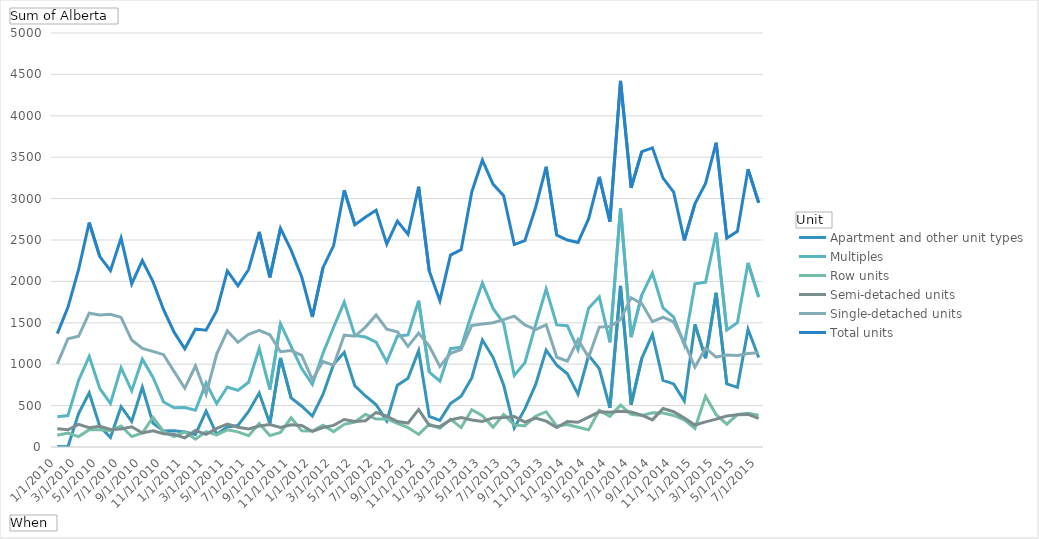
| Category | Apartment and other unit types | Multiples | Row units | Semi-detached units | Single-detached units | Total units |
|---|---|---|---|---|---|---|
| 1/1/2010 | 5 | 366 | 141 | 220 | 1003 | 1369 |
| 2/1/2010 | 3 | 380 | 169 | 208 | 1307 | 1687 |
| 3/1/2010 | 404 | 804 | 126 | 274 | 1337 | 2141 |
| 4/1/2010 | 654 | 1095 | 209 | 232 | 1616 | 2711 |
| 5/1/2010 | 247 | 706 | 209 | 250 | 1593 | 2299 |
| 6/1/2010 | 115 | 527 | 200 | 212 | 1603 | 2130 |
| 7/1/2010 | 487 | 958 | 253 | 218 | 1565 | 2523 |
| 8/1/2010 | 309 | 679 | 125 | 245 | 1292 | 1971 |
| 9/1/2010 | 722 | 1061 | 169 | 170 | 1191 | 2252 |
| 10/1/2010 | 288 | 842 | 358 | 196 | 1155 | 1997 |
| 11/1/2010 | 194 | 543 | 188 | 161 | 1115 | 1658 |
| 12/1/2010 | 196 | 474 | 127 | 151 | 910 | 1384 |
| 1/1/2011 | 181 | 476 | 184 | 111 | 710 | 1186 |
| 2/1/2011 | 151 | 444 | 94 | 199 | 981 | 1425 |
| 3/1/2011 | 434 | 773 | 186 | 153 | 638 | 1411 |
| 4/1/2011 | 153 | 524 | 146 | 225 | 1122 | 1646 |
| 5/1/2011 | 241 | 725 | 208 | 276 | 1402 | 2127 |
| 6/1/2011 | 261 | 683 | 183 | 239 | 1264 | 1947 |
| 7/1/2011 | 429 | 782 | 136 | 217 | 1362 | 2144 |
| 8/1/2011 | 652 | 1189 | 284 | 253 | 1410 | 2599 |
| 9/1/2011 | 284 | 694 | 138 | 272 | 1355 | 2049 |
| 10/1/2011 | 1076 | 1489 | 176 | 237 | 1151 | 2640 |
| 11/1/2011 | 593 | 1214 | 353 | 268 | 1164 | 2378 |
| 12/1/2011 | 492 | 947 | 195 | 260 | 1106 | 2053 |
| 1/1/2012 | 374 | 755 | 193 | 188 | 815 | 1570 |
| 2/1/2012 | 634 | 1133 | 264 | 235 | 1033 | 2166 |
| 3/1/2012 | 999 | 1446 | 186 | 261 | 987 | 2433 |
| 4/1/2012 | 1143 | 1749 | 274 | 332 | 1352 | 3101 |
| 5/1/2012 | 738 | 1347 | 302 | 307 | 1337 | 2684 |
| 6/1/2012 | 616 | 1328 | 395 | 317 | 1448 | 2776 |
| 7/1/2012 | 510 | 1265 | 337 | 418 | 1595 | 2860 |
| 8/1/2012 | 315 | 1028 | 339 | 374 | 1423 | 2451 |
| 9/1/2012 | 745 | 1338 | 285 | 308 | 1390 | 2728 |
| 10/1/2012 | 829 | 1353 | 235 | 289 | 1216 | 2569 |
| 11/1/2012 | 1163 | 1767 | 152 | 452 | 1376 | 3143 |
| 12/1/2012 | 369 | 905 | 275 | 261 | 1220 | 2125 |
| 1/1/2013 | 322 | 794 | 226 | 246 | 973 | 1767 |
| 2/1/2013 | 525 | 1187 | 336 | 326 | 1131 | 2318 |
| 3/1/2013 | 614 | 1205 | 234 | 357 | 1178 | 2383 |
| 4/1/2013 | 834 | 1612 | 451 | 327 | 1468 | 3080 |
| 5/1/2013 | 1293 | 1980 | 379 | 308 | 1485 | 3465 |
| 6/1/2013 | 1083 | 1674 | 240 | 351 | 1501 | 3175 |
| 7/1/2013 | 748 | 1496 | 393 | 355 | 1538 | 3034 |
| 8/1/2013 | 231 | 864 | 264 | 369 | 1581 | 2445 |
| 9/1/2013 | 460 | 1018 | 258 | 300 | 1474 | 2492 |
| 10/1/2013 | 750 | 1472 | 372 | 350 | 1418 | 2890 |
| 11/1/2013 | 1170 | 1908 | 426 | 312 | 1476 | 3384 |
| 12/1/2013 | 987 | 1475 | 252 | 236 | 1084 | 2559 |
| 1/1/2014 | 885 | 1464 | 271 | 308 | 1036 | 2500 |
| 2/1/2014 | 637 | 1174 | 239 | 298 | 1297 | 2471 |
| 3/1/2014 | 1108 | 1675 | 207 | 360 | 1083 | 2758 |
| 4/1/2014 | 947 | 1814 | 442 | 425 | 1448 | 3262 |
| 5/1/2014 | 474 | 1265 | 370 | 421 | 1456 | 2721 |
| 6/1/2014 | 1947 | 2884 | 506 | 431 | 1539 | 4423 |
| 7/1/2014 | 511 | 1328 | 394 | 423 | 1803 | 3131 |
| 8/1/2014 | 1071 | 1836 | 380 | 385 | 1732 | 3568 |
| 9/1/2014 | 1359 | 2100 | 413 | 328 | 1513 | 3613 |
| 10/1/2014 | 805 | 1680 | 410 | 465 | 1567 | 3247 |
| 11/1/2014 | 762 | 1569 | 381 | 426 | 1510 | 3079 |
| 12/1/2014 | 556 | 1233 | 328 | 349 | 1262 | 2495 |
| 1/1/2015 | 1481 | 1971 | 225 | 265 | 965 | 2936 |
| 2/1/2015 | 1073 | 1990 | 613 | 304 | 1193 | 3183 |
| 3/1/2015 | 1862 | 2589 | 390 | 337 | 1086 | 3675 |
| 4/1/2015 | 763 | 1412 | 275 | 374 | 1111 | 2523 |
| 5/1/2015 | 720 | 1501 | 392 | 389 | 1104 | 2605 |
| 6/1/2015 | 1422 | 2224 | 408 | 394 | 1130 | 3354 |
| 7/1/2015 | 1081 | 1811 | 385 | 345 | 1138 | 2949 |